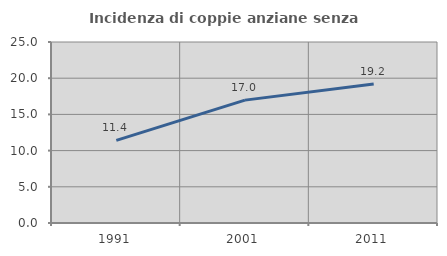
| Category | Incidenza di coppie anziane senza figli  |
|---|---|
| 1991.0 | 11.419 |
| 2001.0 | 16.971 |
| 2011.0 | 19.198 |